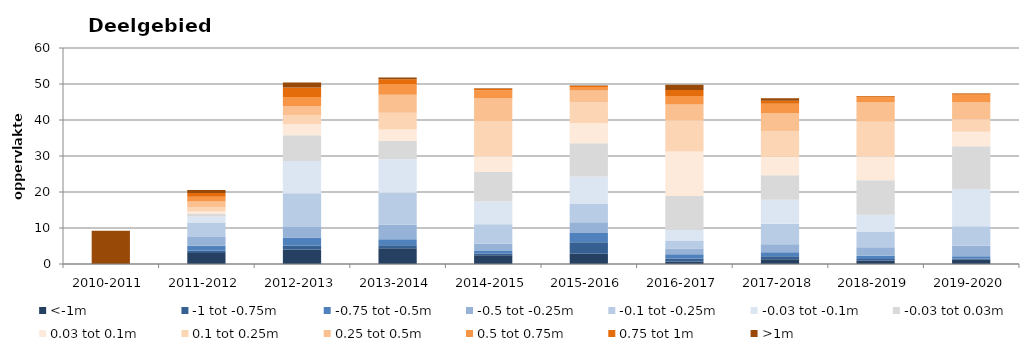
| Category | <-1m | -1 tot -0.75m | -0.75 tot -0.5m | -0.5 tot -0.25m | -0.1 tot -0.25m | -0.03 tot -0.1m | -0.03 tot 0.03m | 0.03 tot 0.1m | 0.1 tot 0.25m | 0.25 tot 0.5m | 0.5 tot 0.75m | 0.75 tot 1m | >1m |
|---|---|---|---|---|---|---|---|---|---|---|---|---|---|
| 2010-2011 | 0 | 0 | 0 | 0 | 0 | 0 | 0 | 0 | 0 | 0 | 0 | 0 | 9.244 |
| 2011-2012 | 3.025 | 0.732 | 1.306 | 2.42 | 4.014 | 1.672 | 0.754 | 0.637 | 1.121 | 1.71 | 1.303 | 1.046 | 0.846 |
| 2012-2013 | 4.011 | 1.134 | 2.207 | 2.956 | 9.377 | 8.927 | 7.133 | 3.104 | 2.367 | 2.599 | 2.602 | 2.618 | 1.375 |
| 2013-2014 | 4.394 | 0.796 | 1.663 | 4.081 | 8.878 | 9.289 | 5.135 | 3.137 | 4.612 | 5.032 | 2.981 | 1.316 | 0.522 |
| 2014-2015 | 2.409 | 0.538 | 0.632 | 2.036 | 5.414 | 6.35 | 8.216 | 4.36 | 9.638 | 6.464 | 2.235 | 0.398 | 0.11 |
| 2015-2016 | 2.828 | 3.202 | 2.606 | 2.98 | 5.206 | 7.491 | 9.245 | 5.589 | 5.728 | 3.298 | 0.97 | 0.316 | 0.113 |
| 2016-2017 | 0.676 | 0.877 | 1.134 | 1.65 | 2.212 | 2.911 | 9.419 | 12.345 | 8.711 | 4.4 | 2.314 | 1.66 | 1.496 |
| 2017-2018 | 1.308 | 0.822 | 1.14 | 2.199 | 5.745 | 6.626 | 6.844 | 5.094 | 7.118 | 5.034 | 2.556 | 0.88 | 0.656 |
| 2018-2019 | 0.952 | 0.411 | 0.93 | 2.356 | 4.364 | 4.67 | 9.567 | 6.626 | 9.638 | 5.482 | 1.408 | 0.224 | 0.051 |
| 2019-2020 | 1.16 | 0.363 | 0.644 | 2.912 | 5.399 | 10.344 | 11.88 | 4.018 | 3.52 | 4.701 | 2.04 | 0.351 | 0.075 |